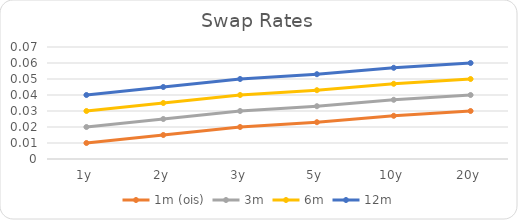
| Category | 1m (ois) | 3m | 6m | 12m |
|---|---|---|---|---|
| 1y | 0.01 | 0.02 | 0.03 | 0.04 |
| 2y | 0.015 | 0.025 | 0.035 | 0.045 |
| 3y | 0.02 | 0.03 | 0.04 | 0.05 |
| 5y | 0.023 | 0.033 | 0.043 | 0.053 |
| 10y | 0.027 | 0.037 | 0.047 | 0.057 |
| 20y | 0.03 | 0.04 | 0.05 | 0.06 |